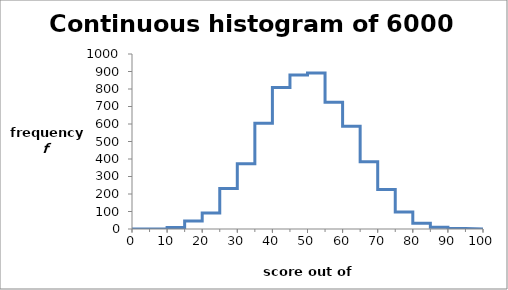
| Category | Series 0 |
|---|---|
| 0.0 | 0 |
| 0.0 | 0 |
| 5.0 | 0 |
| 5.0 | 0 |
| 10.0 | 0 |
| 10.0 | 8 |
| 15.0 | 8 |
| 15.0 | 46 |
| 20.0 | 46 |
| 20.0 | 92 |
| 25.0 | 92 |
| 25.0 | 232 |
| 30.0 | 232 |
| 30.0 | 373 |
| 35.0 | 373 |
| 35.0 | 604 |
| 40.0 | 604 |
| 40.0 | 809 |
| 45.0 | 809 |
| 45.0 | 880 |
| 50.0 | 880 |
| 50.0 | 891 |
| 55.0 | 891 |
| 55.0 | 725 |
| 60.0 | 725 |
| 60.0 | 587 |
| 65.0 | 587 |
| 65.0 | 384 |
| 70.0 | 384 |
| 70.0 | 226 |
| 75.0 | 226 |
| 75.0 | 97 |
| 80.0 | 97 |
| 80.0 | 33 |
| 85.0 | 33 |
| 85.0 | 10 |
| 90.0 | 10 |
| 90.0 | 3 |
| 95.0 | 3 |
| 95.0 | 0 |
| 100.0 | 0 |